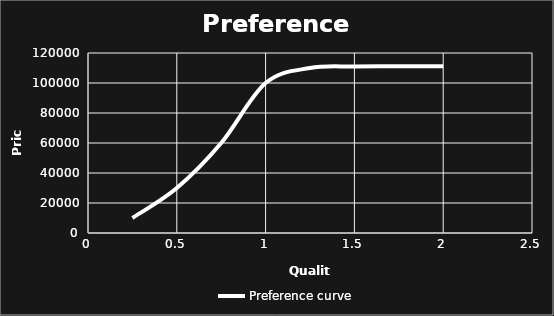
| Category | Preference curve |
|---|---|
| 0.25 | 10000 |
| 0.5 | 30000 |
| 0.75 | 60000 |
| 1.0 | 100000 |
| 1.25 | 110000 |
| 1.5 | 111000 |
| 1.75 | 111100 |
| 2.0 | 111150 |